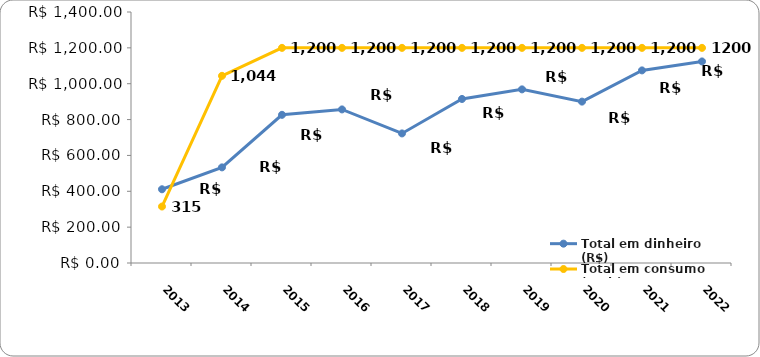
| Category | Total em dinheiro (R$) | Total em consumo (KWh) |
|---|---|---|
| 2013.0 | 411.21 | 315 |
| 2014.0 | 533.32 | 1044 |
| 2015.0 | 826.52 | 1200 |
| 2016.0 | 856.6 | 1200 |
| 2017.0 | 722.66 | 1200 |
| 2018.0 | 914.97 | 1200 |
| 2019.0 | 968.42 | 1200 |
| 2020.0 | 900.22 | 1200 |
| 2021.0 | 1074.28 | 1200 |
| 2022.0 | 1124.2 | 1200 |